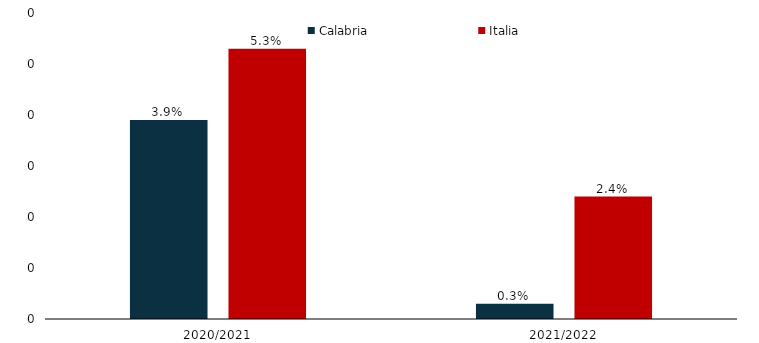
| Category | Calabria | Italia |
|---|---|---|
| 2020/2021 | 0.039 | 0.053 |
| 2021/2022 | 0.003 | 0.024 |